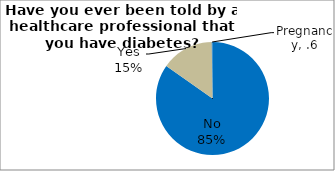
| Category | Series 0 |
|---|---|
| No | 84.762 |
| Yes | 15.028 |
| Pregnancy | 0.21 |